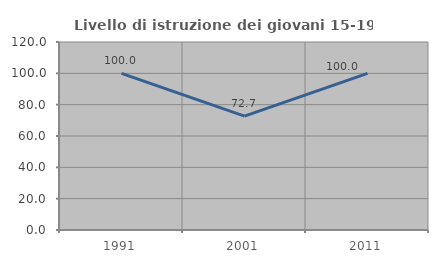
| Category | Livello di istruzione dei giovani 15-19 anni |
|---|---|
| 1991.0 | 100 |
| 2001.0 | 72.727 |
| 2011.0 | 100 |